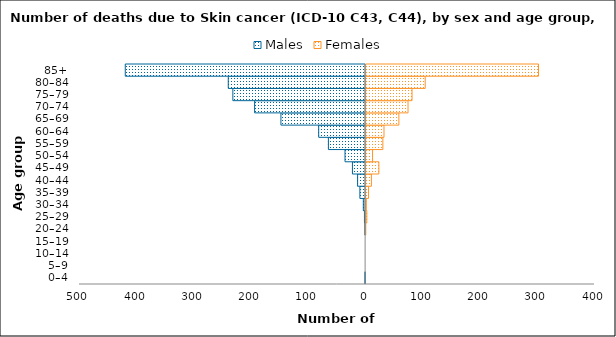
| Category | Males | Females |
|---|---|---|
| 0–4 | -1 | 0 |
| 5–9 | 0 | 0 |
| 10–14 | 0 | 0 |
| 15–19 | 0 | 0 |
| 20–24 | -1 | 1 |
| 25–29 | -2 | 3 |
| 30–34 | -4 | 2 |
| 35–39 | -10 | 6 |
| 40–44 | -14 | 11 |
| 45–49 | -23 | 24 |
| 50–54 | -36 | 13 |
| 55–59 | -65 | 31 |
| 60–64 | -82 | 33 |
| 65–69 | -148 | 59 |
| 70–74 | -194 | 75 |
| 75–79 | -232 | 82 |
| 80–84 | -240 | 105 |
| 85+ | -420 | 303 |